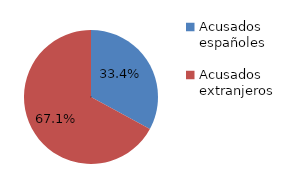
| Category | Series 0 |
|---|---|
| Acusados españoles | 54 |
| Acusados extranjeros | 110 |
| Acusados Personas Jurídicas | 0 |